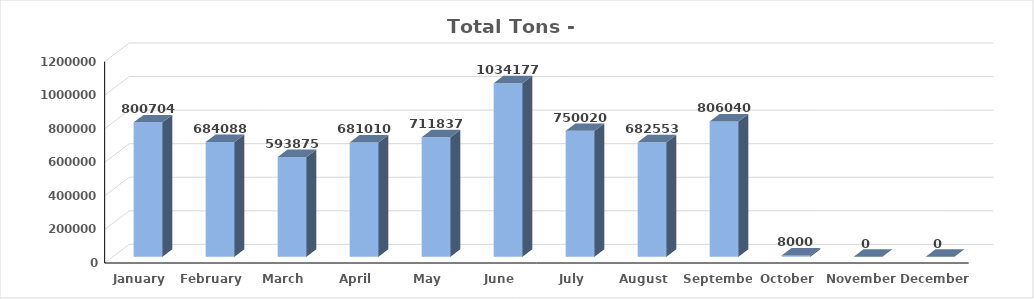
| Category | Series 0 |
|---|---|
| January | 800704 |
| February | 684088 |
| March | 593875 |
| April | 681010 |
| May | 711837 |
| June | 1034177 |
| July | 750020 |
| August | 682553 |
| September | 806040 |
| October | 8000 |
| November | 0 |
| December | 0 |